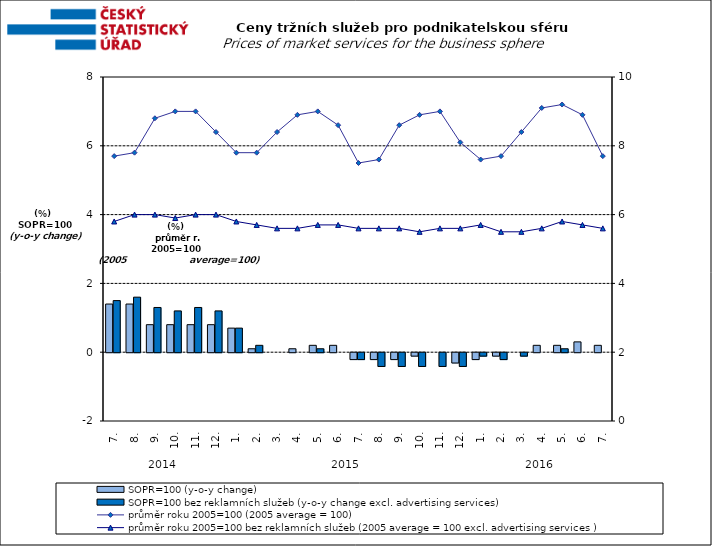
| Category | SOPR=100 (y-o-y change)   | SOPR=100 bez reklamních služeb (y-o-y change excl. advertising services)   |
|---|---|---|
| 0 | 1.4 | 1.5 |
| 1 | 1.4 | 1.6 |
| 2 | 0.8 | 1.3 |
| 3 | 0.8 | 1.2 |
| 4 | 0.8 | 1.3 |
| 5 | 0.8 | 1.2 |
| 6 | 0.7 | 0.7 |
| 7 | 0.1 | 0.2 |
| 8 | 0 | 0 |
| 9 | 0.1 | 0 |
| 10 | 0.2 | 0.1 |
| 11 | 0.2 | 0 |
| 12 | -0.2 | -0.2 |
| 13 | -0.2 | -0.4 |
| 14 | -0.2 | -0.4 |
| 15 | -0.1 | -0.4 |
| 16 | 0 | -0.4 |
| 17 | -0.3 | -0.4 |
| 18 | -0.2 | -0.1 |
| 19 | -0.1 | -0.2 |
| 20 | 0 | -0.1 |
| 21 | 0.2 | 0 |
| 22 | 0.2 | 0.1 |
| 23 | 0.3 | 0 |
| 24 | 0.2 | 0 |